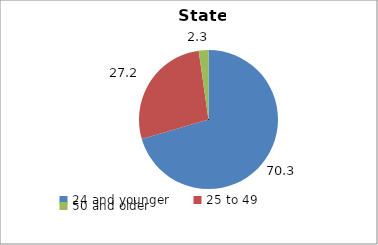
| Category | Series 0 | Series 1 |
|---|---|---|
| 24 and younger | 70.329 | 70.329 |
| 25 to 49 | 27.217 | 27.217 |
| 50 and older | 2.262 | 2.262 |